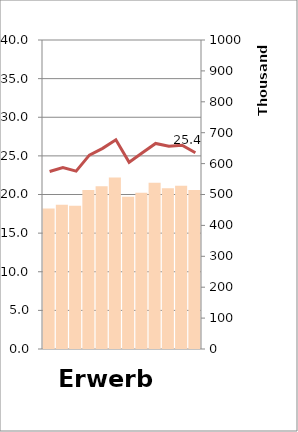
| Category | absolut |
|---|---|
| 0 | 454423 |
| 1 | 466700 |
| 2 | 463464 |
| 3 | 514603 |
| 4 | 526684 |
| 5 | 554704 |
| 6 | 492696 |
| 7 | 505935 |
| 8 | 537740 |
| 9 | 520294 |
| 10 | 528157 |
| 11 | 514875 |